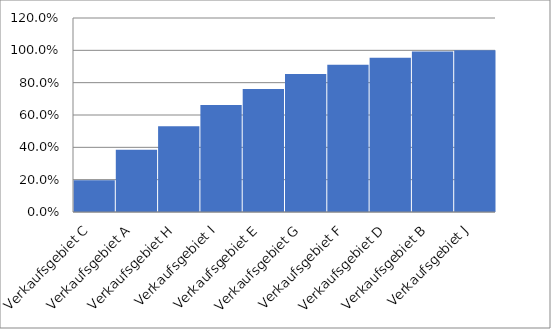
| Category | Series 0 |
|---|---|
| 10.0 | 0.196 |
| 20.0 | 0.384 |
| 30.0 | 0.53 |
| 40.0 | 0.662 |
| 50.0 | 0.762 |
| 60.0 | 0.854 |
| 70.0 | 0.911 |
| 89.0 | 0.954 |
| 90.0 | 0.993 |
| 100.0 | 1 |